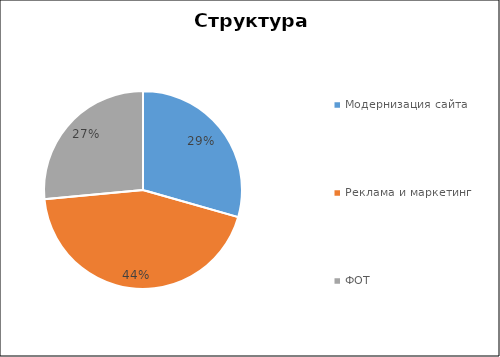
| Category | Series 0 |
|---|---|
| Модернизация сайта | 1000 |
| Реклама и маркетинг | 1500 |
| ФОТ | 900 |